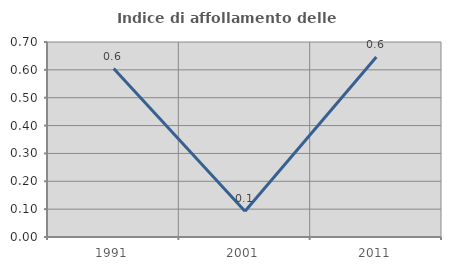
| Category | Indice di affollamento delle abitazioni  |
|---|---|
| 1991.0 | 0.605 |
| 2001.0 | 0.093 |
| 2011.0 | 0.646 |